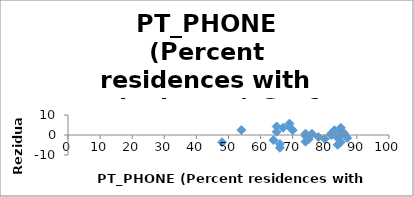
| Category | Series 0 |
|---|---|
| 82.0 | -0.043 |
| 66.0 | -4.463 |
| 80.0 | -1.976 |
| 74.0 | -0.43 |
| 65.0 | 4.28 |
| 64.0 | -2.563 |
| 82.0 | 0.698 |
| 85.0 | -0.018 |
| 78.0 | -1.041 |
| 74.0 | 0.704 |
| 69.0 | 5.697 |
| 85.0 | 3.612 |
| 69.0 | 4.051 |
| 83.0 | 2.202 |
| 54.0 | 2.49 |
| 65.0 | 1.611 |
| 76.0 | 0.608 |
| 67.0 | 3.654 |
| 85.0 | 1.87 |
| 84.0 | -4.885 |
| 84.0 | -1.406 |
| 86.0 | 0.927 |
| 66.0 | -6.394 |
| 74.0 | -3.336 |
| 87.0 | -1.458 |
| 85.0 | -3.493 |
| 70.0 | 2.445 |
| 75.0 | -2.068 |
| 48.0 | -3.622 |
| 83.0 | 2.347 |